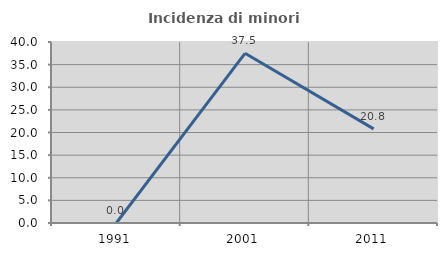
| Category | Incidenza di minori stranieri |
|---|---|
| 1991.0 | 0 |
| 2001.0 | 37.5 |
| 2011.0 | 20.792 |